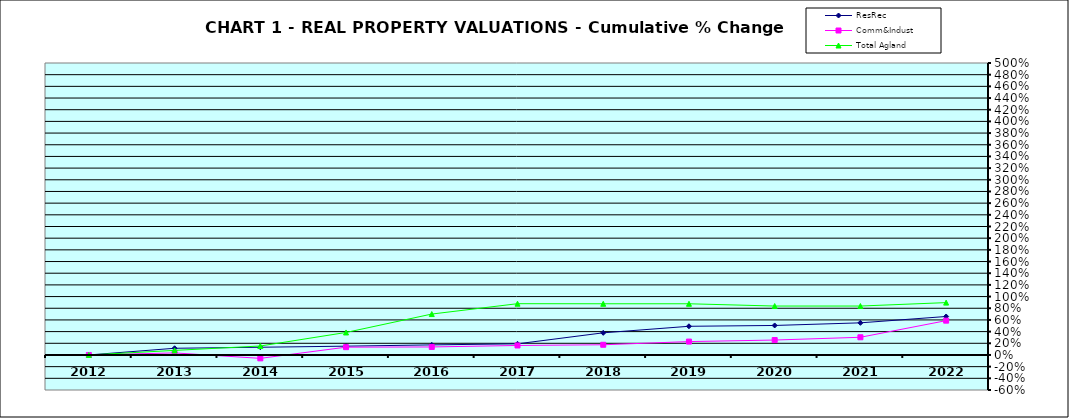
| Category | ResRec | Comm&Indust | Total Agland |
|---|---|---|---|
| 2012.0 | 0 | 0 | 0 |
| 2013.0 | 0.115 | 0.035 | 0.078 |
| 2014.0 | 0.132 | -0.058 | 0.153 |
| 2015.0 | 0.151 | 0.134 | 0.385 |
| 2016.0 | 0.173 | 0.137 | 0.701 |
| 2017.0 | 0.191 | 0.162 | 0.878 |
| 2018.0 | 0.379 | 0.175 | 0.877 |
| 2019.0 | 0.491 | 0.229 | 0.877 |
| 2020.0 | 0.505 | 0.256 | 0.838 |
| 2021.0 | 0.55 | 0.303 | 0.838 |
| 2022.0 | 0.659 | 0.588 | 0.896 |